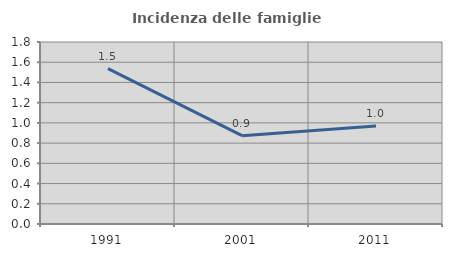
| Category | Incidenza delle famiglie numerose |
|---|---|
| 1991.0 | 1.537 |
| 2001.0 | 0.874 |
| 2011.0 | 0.97 |